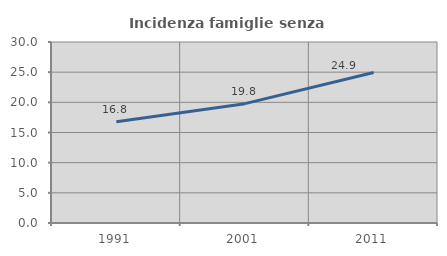
| Category | Incidenza famiglie senza nuclei |
|---|---|
| 1991.0 | 16.772 |
| 2001.0 | 19.782 |
| 2011.0 | 24.943 |